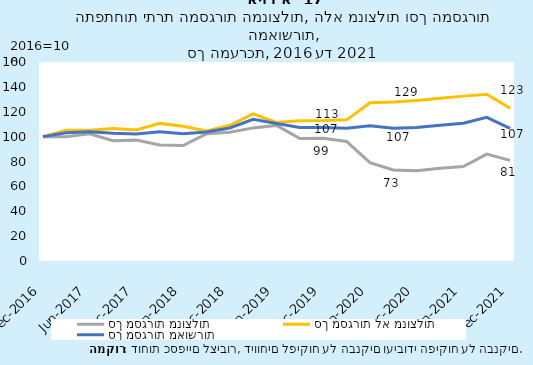
| Category | סך מסגרות מנוצלות | סך מסגרות לא מנוצלות | סך מסגרות מאושרות |
|---|---|---|---|
| 2016-12-31 | 100 | 100 | 100 |
| 2017-03-31 | 99.998 | 105.18 | 103.184 |
| 2017-06-30 | 102.24 | 105.065 | 103.976 |
| 2017-09-30 | 96.766 | 106.554 | 102.783 |
| 2017-12-31 | 97.183 | 105.297 | 102.171 |
| 2018-03-31 | 93.219 | 110.638 | 103.927 |
| 2018-06-30 | 92.787 | 108.361 | 102.361 |
| 2018-09-30 | 102.236 | 104.61 | 103.695 |
| 2018-12-31 | 103.594 | 109.087 | 106.971 |
| 2019-03-31 | 107.023 | 118.261 | 113.931 |
| 2019-06-30 | 109.015 | 111.391 | 110.475 |
| 2019-09-30 | 98.42 | 112.853 | 107.293 |
| 2019-12-31 | 98.672 | 112.894 | 107.415 |
| 2020-03-31 | 96.099 | 113.478 | 106.782 |
| 2020-06-30 | 79.067 | 127.175 | 108.64 |
| 2020-09-30 | 73.183 | 127.87 | 106.8 |
| 2020-12-31 | 72.615 | 129.125 | 107.353 |
| 2021-03-31 | 74.648 | 130.853 | 109.199 |
| 2021-06-30 | 76.003 | 132.563 | 110.772 |
| 2021-09-30 | 85.96 | 134.065 | 115.531 |
| 2021-12-31 | 80.869 | 122.794 | 106.641 |